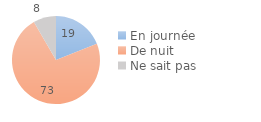
| Category | Series 0 |
|---|---|
| En journée | 18.978 |
| De nuit | 72.645 |
| Ne sait pas | 8.377 |